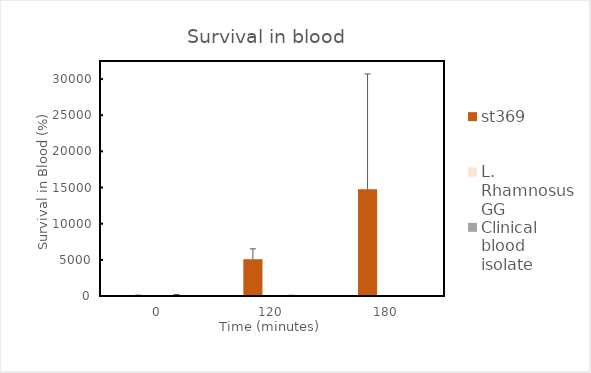
| Category | st369 | L. Rhamnosus GG | Clinical blood isolate |
|---|---|---|---|
| 0.0 | 100 | 100 | 100 |
| 120.0 | 5087.42 | 30.455 | 47.154 |
| 180.0 | 14754.797 | 26.521 | 31.127 |